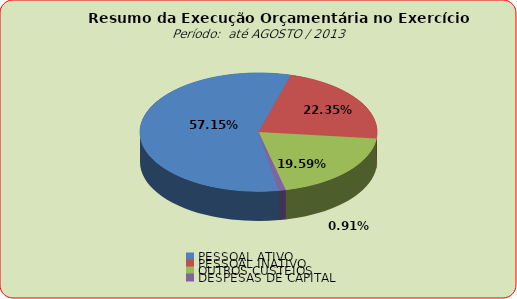
| Category | Series 0 |
|---|---|
| PESSOAL ATIVO | 63230013.95 |
| PESSOAL INATIVO | 24725119.65 |
| OUTROS CUSTEIOS | 21677142.45 |
| DESPESAS DE CAPITAL | 1001539.05 |